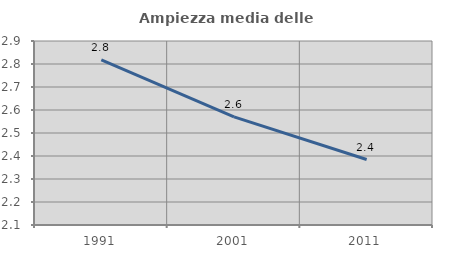
| Category | Ampiezza media delle famiglie |
|---|---|
| 1991.0 | 2.818 |
| 2001.0 | 2.57 |
| 2011.0 | 2.385 |